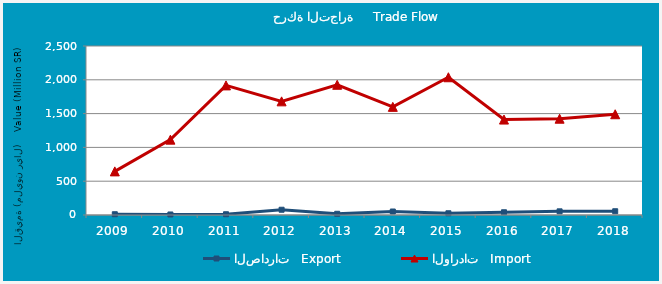
| Category | الصادرات   Export | الواردات   Import |
|---|---|---|
| 2009.0 | 11406058 | 645138349 |
| 2010.0 | 7736738 | 1114765362 |
| 2011.0 | 11279436 | 1917271362 |
| 2012.0 | 77708787 | 1681256522 |
| 2013.0 | 17900142 | 1926128741 |
| 2014.0 | 51649153 | 1599485303 |
| 2015.0 | 25776661 | 2037593976 |
| 2016.0 | 40599260 | 1411758155 |
| 2017.0 | 54161610 | 1424375796 |
| 2018.0 | 55532750 | 1490473311 |